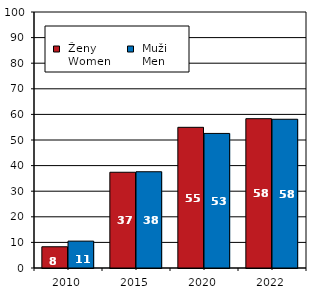
| Category |  Ženy 
 Women |  Muži 
 Men |
|---|---|---|
| 2010.0 | 8.3 | 10.5 |
| 2015.0 | 37.4 | 37.6 |
| 2020.0 | 54.955 | 52.565 |
| 2022.0 | 58.33 | 58.1 |